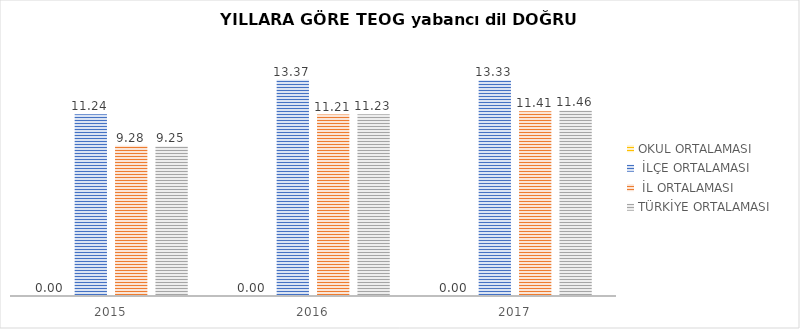
| Category | OKUL ORTALAMASI |  İLÇE ORTALAMASI |  İL ORTALAMASI  | TÜRKİYE ORTALAMASI  |
|---|---|---|---|---|
| 0 | 0 | 11.235 | 9.278 | 9.254 |
| 1 | 0 | 13.365 | 11.205 | 11.232 |
| 2 | 0 | 13.326 | 11.414 | 11.463 |